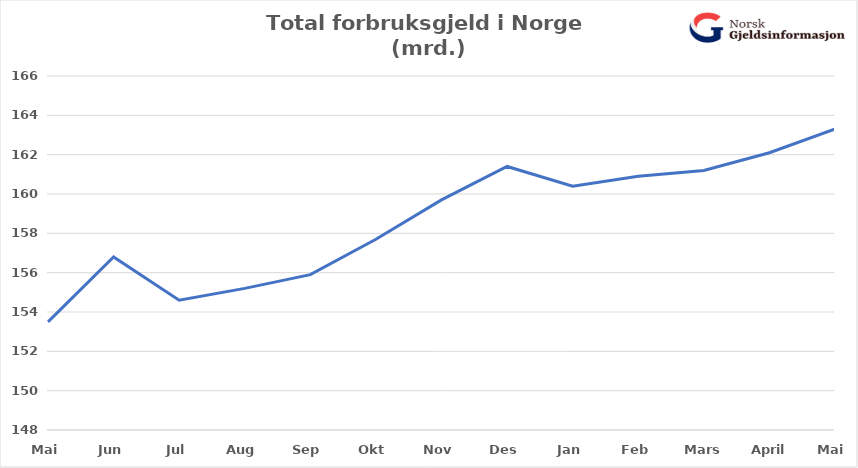
| Category | Total usikret gjeld (mrd) |
|---|---|
| Mai | 153.5 |
| Jun | 156.8 |
| Jul | 154.6 |
| Aug | 155.2 |
| Sep | 155.9 |
| Okt | 157.7 |
| Nov | 159.7 |
| Des | 161.4 |
| Jan | 160.4 |
| Feb | 160.9 |
| Mars | 161.2 |
| April | 162.1 |
| Mai | 163.3 |